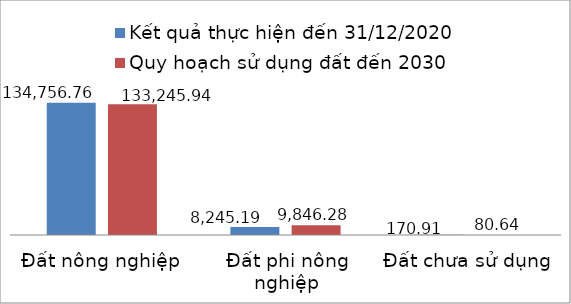
| Category | Kết quả thực hiện đến 31/12/2020 | Quy hoạch sử dụng đất đến 2030 |
|---|---|---|
| Đất nông nghiệp | 134756.76 | 133245.94 |
| Đất phi nông nghiệp | 8245.19 | 9846.28 |
| Đất chưa sử dụng | 170.91 | 80.64 |